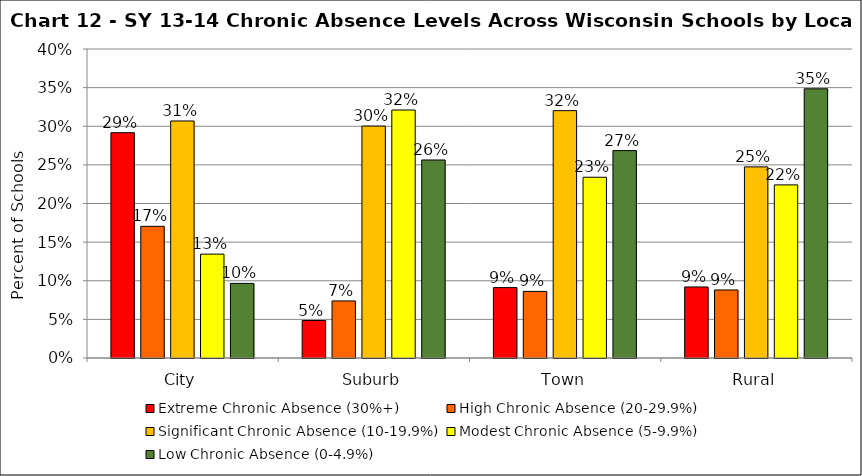
| Category | Extreme Chronic Absence (30%+) | High Chronic Absence (20-29.9%) | Significant Chronic Absence (10-19.9%) | Modest Chronic Absence (5-9.9%) | Low Chronic Absence (0-4.9%) |
|---|---|---|---|---|---|
| 0 | 0.292 | 0.17 | 0.307 | 0.134 | 0.097 |
| 1 | 0.048 | 0.074 | 0.3 | 0.321 | 0.256 |
| 2 | 0.091 | 0.086 | 0.32 | 0.234 | 0.268 |
| 3 | 0.092 | 0.088 | 0.247 | 0.224 | 0.348 |